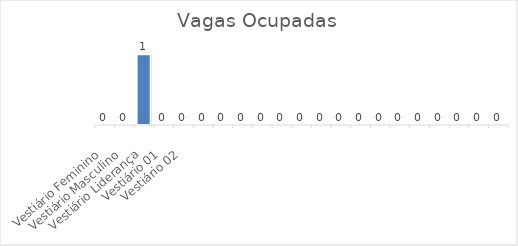
| Category | Vagas Ocupadas |
|---|---|
| Vestiário Feminino | 0 |
| Vestiário Masculino | 0 |
| Vestiário Liderança | 1 |
| Vestiário 01 | 0 |
| Vestiário 02 | 0 |